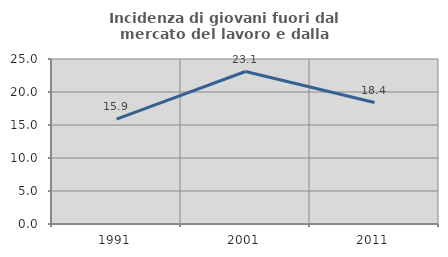
| Category | Incidenza di giovani fuori dal mercato del lavoro e dalla formazione  |
|---|---|
| 1991.0 | 15.882 |
| 2001.0 | 23.104 |
| 2011.0 | 18.401 |